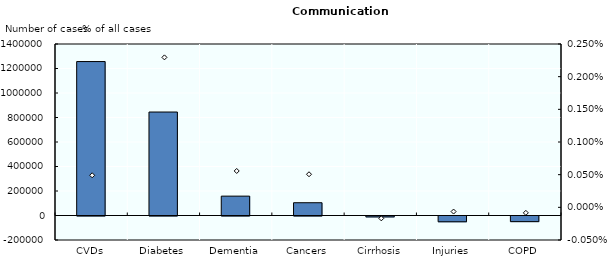
| Category | Number of cases |
|---|---|
| CVDs | 1256723.495 |
| Diabetes | 844707.234 |
| Dementia | 158118.831 |
| Cancers | 104260.838 |
| Cirrhosis | -7275.208 |
| Injuries | -47182.29 |
| COPD | -46041.449 |